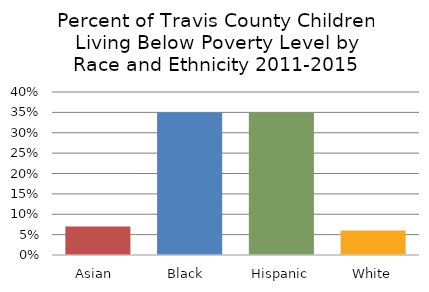
| Category | Series 0 |
|---|---|
| Asian  | 0.07 |
| Black  | 0.35 |
| Hispanic | 0.35 |
| White | 0.06 |